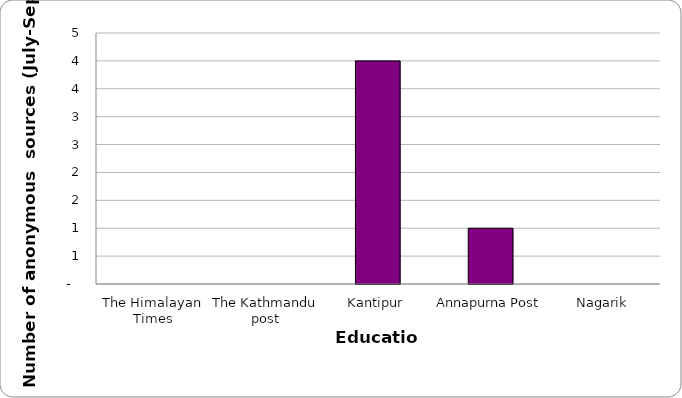
| Category | Education |
|---|---|
| The Himalayan Times | 0 |
| The Kathmandu post | 0 |
| Kantipur | 4 |
| Annapurna Post | 1 |
| Nagarik | 0 |